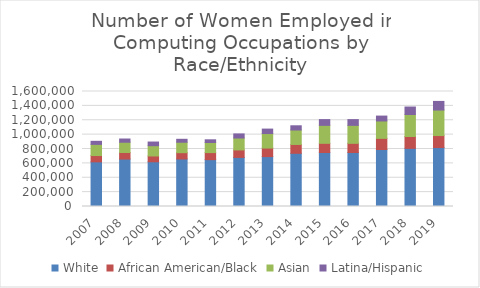
| Category | White | African American/Black | Asian | Latina/Hispanic |
|---|---|---|---|---|
| 2007 | 621000 | 88000 | 155000 | 43000 |
| 2008 | 660000 | 91000 | 143000 | 45000 |
| 2009 | 622000 | 81000 | 143000 | 51000 |
| 2010 | 661000 | 88000 | 145000 | 41000 |
| 2011 | 652000 | 98000 | 140000 | 38000 |
| 2012 | 683000 | 104000 | 166000 | 57000 |
| 2013 | 694000 | 119000 | 202000 | 62000 |
| 2014 | 740000 | 123000 | 201000 | 59000 |
| 2015 | 751000 | 128000 | 250000 | 80000 |
| 2016 | 751000 | 128000 | 250000 | 80000 |
| 2017 | 793000 | 155000 | 242000 | 68000 |
| 2018 | 809000 | 165000 | 306000 | 104000 |
| 2019 | 820000 | 167000 | 355000 | 120000 |